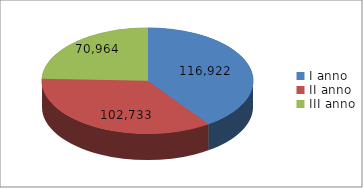
| Category | Series 0 |
|---|---|
| I anno | 116922 |
| II anno | 102733 |
| III anno | 70964 |